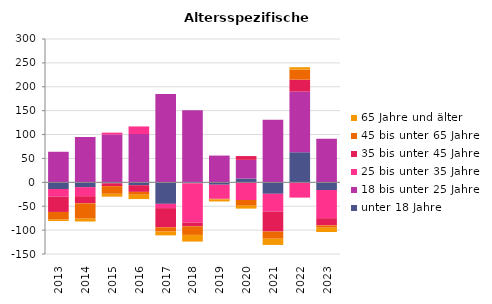
| Category | unter 18 Jahre | 18 bis unter 25 Jahre | 25 bis unter 35 Jahre | 35 bis unter 45 Jahre | 45 bis unter 65 Jahre | 65 Jahre und älter |
|---|---|---|---|---|---|---|
| 2013.0 | -14 | 64 | -16 | -32 | -16 | -3 |
| 2014.0 | -10 | 95 | -19 | -15 | -32 | -6 |
| 2015.0 | -2 | 100 | 4 | -6 | -16 | -6 |
| 2016.0 | -6 | 101 | 16 | -14 | -6 | -9 |
| 2017.0 | -45 | 185 | -9 | -40 | -9 | -8 |
| 2018.0 | -2 | 151 | -82 | -8 | -18 | -14 |
| 2019.0 | -5 | 56 | -29 | -1 | -1 | -4 |
| 2020.0 | 8 | 39 | -37 | 8 | -12 | -6 |
| 2021.0 | -24 | 131 | -37 | -42 | -15 | -13 |
| 2022.0 | 63 | 127 | -32 | 25 | 21 | 5 |
| 2023.0 | -16 | 91 | -59 | -15 | -5 | -9 |